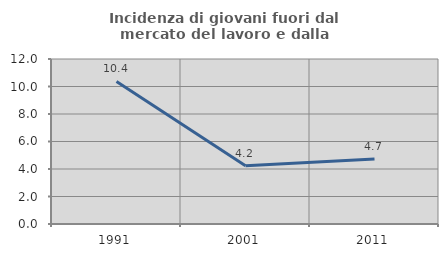
| Category | Incidenza di giovani fuori dal mercato del lavoro e dalla formazione  |
|---|---|
| 1991.0 | 10.367 |
| 2001.0 | 4.239 |
| 2011.0 | 4.719 |